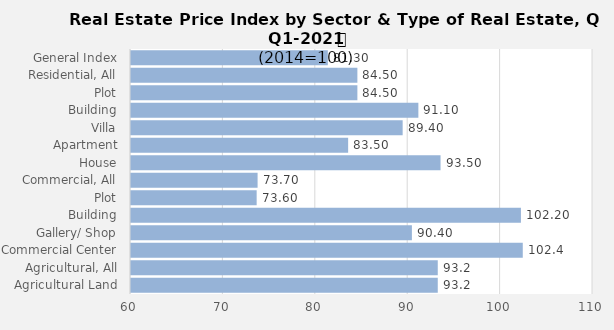
| Category | 2021 |
|---|---|
| General Index | 81.3 |
| Residential, All | 84.5 |
| Plot | 84.5 |
| Building | 91.1 |
| Villa | 89.4 |
| Apartment | 83.5 |
| House | 93.5 |
| Commercial, All | 73.7 |
| Plot | 73.6 |
| Building | 102.2 |
| Gallery/ Shop | 90.4 |
| Commercial Center | 102.4 |
| Agricultural, All | 93.2 |
| Agricultural Land | 93.2 |